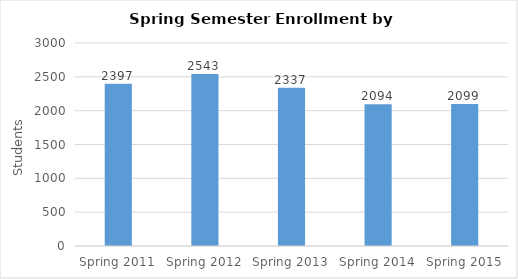
| Category | College (Headcount) |
|---|---|
| Spring 2011 | 2397 |
| Spring 2012 | 2543 |
| Spring 2013 | 2337 |
| Spring 2014 | 2094 |
| Spring 2015 | 2099 |